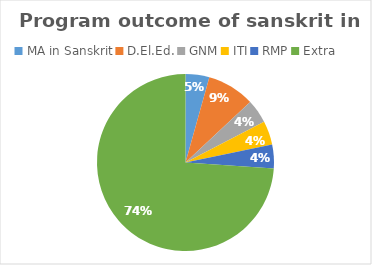
| Category | Series 0 |
|---|---|
| MA in Sanskrit | 1 |
| D.El.Ed. | 2 |
| GNM | 1 |
| ITI | 1 |
| RMP | 1 |
| Extra | 17 |